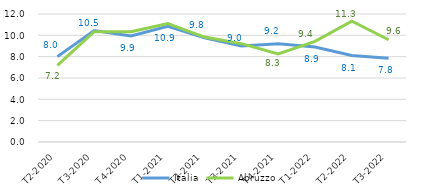
| Category | Italia | Abruzzo |
|---|---|---|
|   T2-2020 | 8.005 | 7.179 |
|   T3-2020 | 10.452 | 10.338 |
|   T4-2020 | 9.94 | 10.345 |
|   T1-2021 | 10.854 | 11.098 |
|   T2-2021 | 9.774 | 9.837 |
|   T3-2021 | 9.006 | 9.219 |
|   T4-2021 | 9.222 | 8.254 |
|   T1-2022 | 8.898 | 9.43 |
|   T2-2022 | 8.105 | 11.322 |
|   T3-2022 | 7.843 | 9.583 |